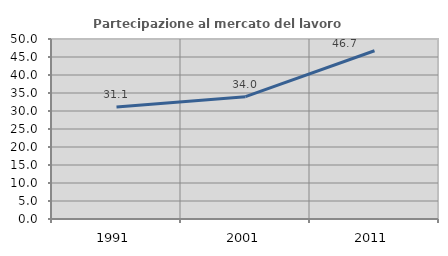
| Category | Partecipazione al mercato del lavoro  femminile |
|---|---|
| 1991.0 | 31.1 |
| 2001.0 | 33.971 |
| 2011.0 | 46.734 |